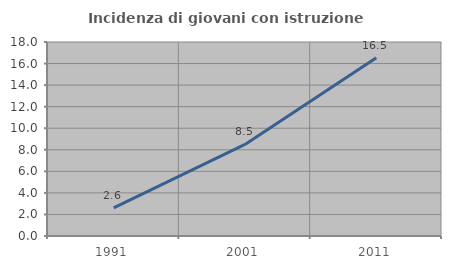
| Category | Incidenza di giovani con istruzione universitaria |
|---|---|
| 1991.0 | 2.614 |
| 2001.0 | 8.497 |
| 2011.0 | 16.535 |